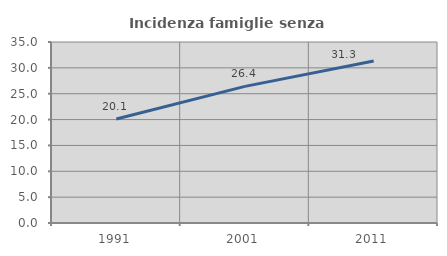
| Category | Incidenza famiglie senza nuclei |
|---|---|
| 1991.0 | 20.097 |
| 2001.0 | 26.422 |
| 2011.0 | 31.311 |